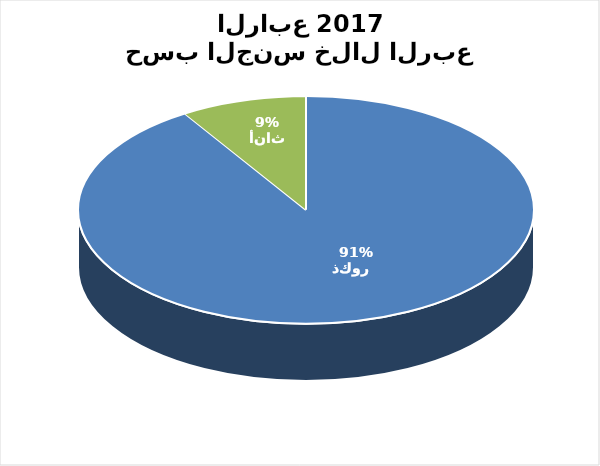
| Category | Series 0 |
|---|---|
| ذكور    | 1577974 |
| أناث | 154584 |